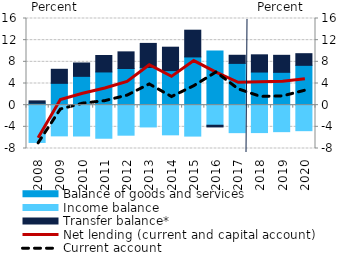
| Category | Balance of goods and services | Income balance | Transfer balance* |
|---|---|---|---|
| 2008.0 | 0.357 | -6.883 | 0.435 |
| 2009.0 | 4.031 | -5.668 | 2.592 |
| 2010.0 | 5.32 | -5.693 | 2.467 |
| 2011.0 | 6.13 | -6.106 | 3.042 |
| 2012.0 | 6.766 | -5.543 | 3.075 |
| 2013.0 | 6.964 | -4.021 | 4.439 |
| 2014.0 | 6.376 | -5.476 | 4.328 |
| 2015.0 | 8.905 | -5.71 | 4.936 |
| 2016.0 | 10.015 | -3.706 | -0.313 |
| 2017.0 | 7.712 | -5.074 | 1.5 |
| 2018.0 | 6.113 | -5.063 | 3.181 |
| 2019.0 | 6.064 | -4.891 | 3.14 |
| 2020.0 | 7.353 | -4.709 | 2.152 |